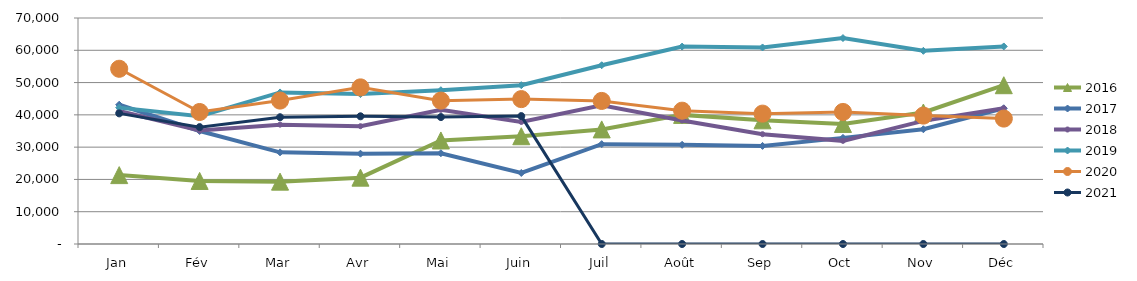
| Category | 2015 | 2016 | 2017 | 2018 | 2019 | 2020 | 2021 |
|---|---|---|---|---|---|---|---|
| Jan |  | 21335.134 | 43138.429 | 41189.736 | 42238.432 | 54273.068 | 40458.51 |
| Fév |  | 19532.337 | 35009.004 | 35137.047 | 39568.195 | 40883.319 | 36200.926 |
| Mar |  | 19313.57 | 28389.673 | 36966.816 | 46942.202 | 44426.392 | 39262.158 |
| Avr |  | 20550.618 | 27972.802 | 36485.223 | 46427.766 | 48509.843 | 39555.16 |
| Mai |  | 32066.609 | 28116.194 | 41558.724 | 47634.031 | 44407.424 | 39315.181 |
| Juin |  | 33383.309 | 22002.869 | 37797.134 | 49186.221 | 44874.513 | 39615.13 |
| Juil |  | 35495.63 | 30926.131 | 42927.847 | 55367.883 | 44316.236 | 0 |
| Août |  | 39992.765 | 30717.708 | 38263.165 | 61146.365 | 41285.559 | 0 |
| Sep |  | 38306.611 | 30378.863 | 34011.672 | 60874.85 | 40379.909 | 0 |
| Oct |  | 37188.976 | 32868.78 | 31946.792 | 63789.634 | 40903.528 | 0 |
| Nov |  | 40729.636 | 35537.079 | 38139.513 | 59829.208 | 39772.437 | 0 |
| Déc |  | 49180.232 | 42040.249 | 42064.579 | 61190.831 | 38851.183 | 0 |